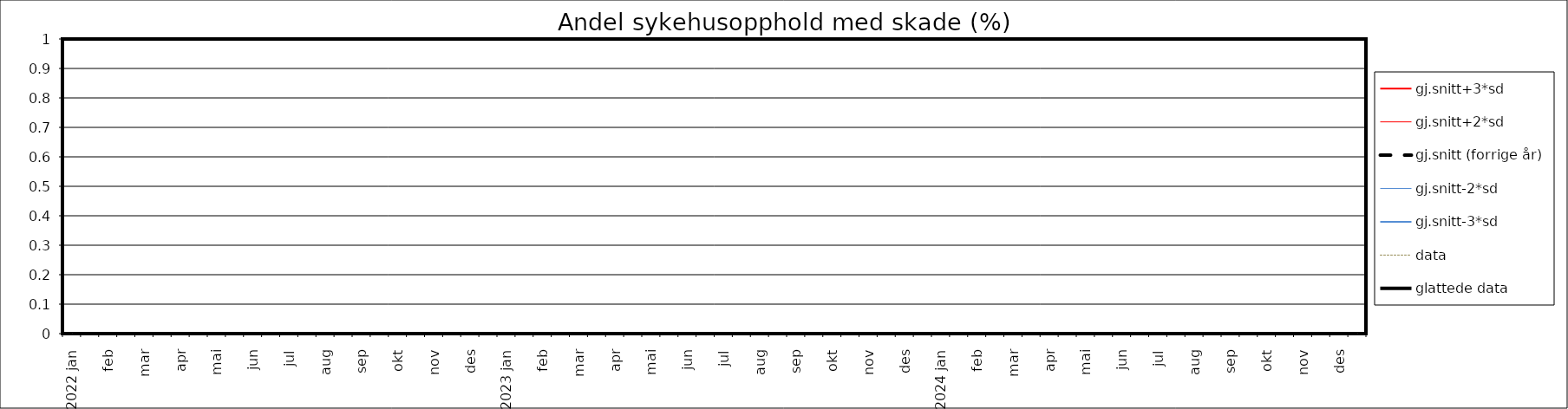
| Category | gj.snitt+3*sd | gj.snitt+2*sd | gj.snitt (forrige år) | gj.snitt-2*sd | gj.snitt-3*sd | data | glattede data |
|---|---|---|---|---|---|---|---|
| 2022 jan | 0 | 0 | 0 | 0 | 0 | 0 | 0 |
|  | 0 | 0 | 0 | 0 | 0 | 0 | 0 |
| feb | 0 | 0 | 0 | 0 | 0 | 0 | 0 |
|  | 0 | 0 | 0 | 0 | 0 | 0 | 0 |
| mar | 0 | 0 | 0 | 0 | 0 | 0 | 0 |
|  | 0 | 0 | 0 | 0 | 0 | 0 | 0 |
| apr | 0 | 0 | 0 | 0 | 0 | 0 | 0 |
|  | 0 | 0 | 0 | 0 | 0 | 0 | 0 |
| mai | 0 | 0 | 0 | 0 | 0 | 0 | 0 |
|  | 0 | 0 | 0 | 0 | 0 | 0 | 0 |
| jun | 0 | 0 | 0 | 0 | 0 | 0 | 0 |
|  | 0 | 0 | 0 | 0 | 0 | 0 | 0 |
| jul | 0 | 0 | 0 | 0 | 0 | 0 | 0 |
|  | 0 | 0 | 0 | 0 | 0 | 0 | 0 |
| aug | 0 | 0 | 0 | 0 | 0 | 0 | 0 |
|  | 0 | 0 | 0 | 0 | 0 | 0 | 0 |
| sep | 0 | 0 | 0 | 0 | 0 | 0 | 0 |
|  | 0 | 0 | 0 | 0 | 0 | 0 | 0 |
| okt | 0 | 0 | 0 | 0 | 0 | 0 | 0 |
|  | 0 | 0 | 0 | 0 | 0 | 0 | 0 |
| nov | 0 | 0 | 0 | 0 | 0 | 0 | 0 |
|  | 0 | 0 | 0 | 0 | 0 | 0 | 0 |
| des | 0 | 0 | 0 | 0 | 0 | 0 | 0 |
|  | 0 | 0 | 0 | 0 | 0 | 0 | 0 |
| 2023 jan | 0 | 0 | 0 | 0 | 0 | 0 | 0 |
|  | 0 | 0 | 0 | 0 | 0 | 0 | 0 |
| feb | 0 | 0 | 0 | 0 | 0 | 0 | 0 |
|  | 0 | 0 | 0 | 0 | 0 | 0 | 0 |
| mar | 0 | 0 | 0 | 0 | 0 | 0 | 0 |
|  | 0 | 0 | 0 | 0 | 0 | 0 | 0 |
| apr | 0 | 0 | 0 | 0 | 0 | 0 | 0 |
|  | 0 | 0 | 0 | 0 | 0 | 0 | 0 |
| mai | 0 | 0 | 0 | 0 | 0 | 0 | 0 |
|  | 0 | 0 | 0 | 0 | 0 | 0 | 0 |
| jun | 0 | 0 | 0 | 0 | 0 | 0 | 0 |
|  | 0 | 0 | 0 | 0 | 0 | 0 | 0 |
| jul | 0 | 0 | 0 | 0 | 0 | 0 | 0 |
|  | 0 | 0 | 0 | 0 | 0 | 0 | 0 |
| aug | 0 | 0 | 0 | 0 | 0 | 0 | 0 |
|  | 0 | 0 | 0 | 0 | 0 | 0 | 0 |
| sep | 0 | 0 | 0 | 0 | 0 | 0 | 0 |
|  | 0 | 0 | 0 | 0 | 0 | 0 | 0 |
| okt | 0 | 0 | 0 | 0 | 0 | 0 | 0 |
|  | 0 | 0 | 0 | 0 | 0 | 0 | 0 |
| nov | 0 | 0 | 0 | 0 | 0 | 0 | 0 |
|  | 0 | 0 | 0 | 0 | 0 | 0 | 0 |
| des | 0 | 0 | 0 | 0 | 0 | 0 | 0 |
|  | 0 | 0 | 0 | 0 | 0 | 0 | 0 |
| 2024 jan | 0 | 0 | 0 | 0 | 0 | 0 | 0 |
|  | 0 | 0 | 0 | 0 | 0 | 0 | 0 |
| feb | 0 | 0 | 0 | 0 | 0 | 0 | 0 |
|  | 0 | 0 | 0 | 0 | 0 | 0 | 0 |
| mar | 0 | 0 | 0 | 0 | 0 | 0 | 0 |
|  | 0 | 0 | 0 | 0 | 0 | 0 | 0 |
| apr | 0 | 0 | 0 | 0 | 0 | 0 | 0 |
|  | 0 | 0 | 0 | 0 | 0 | 0 | 0 |
| mai | 0 | 0 | 0 | 0 | 0 | 0 | 0 |
|  | 0 | 0 | 0 | 0 | 0 | 0 | 0 |
| jun | 0 | 0 | 0 | 0 | 0 | 0 | 0 |
|  | 0 | 0 | 0 | 0 | 0 | 0 | 0 |
| jul | 0 | 0 | 0 | 0 | 0 | 0 | 0 |
|  | 0 | 0 | 0 | 0 | 0 | 0 | 0 |
| aug | 0 | 0 | 0 | 0 | 0 | 0 | 0 |
|  | 0 | 0 | 0 | 0 | 0 | 0 | 0 |
| sep | 0 | 0 | 0 | 0 | 0 | 0 | 0 |
|  | 0 | 0 | 0 | 0 | 0 | 0 | 0 |
| okt | 0 | 0 | 0 | 0 | 0 | 0 | 0 |
|  | 0 | 0 | 0 | 0 | 0 | 0 | 0 |
| nov | 0 | 0 | 0 | 0 | 0 | 0 | 0 |
|  | 0 | 0 | 0 | 0 | 0 | 0 | 0 |
| des | 0 | 0 | 0 | 0 | 0 | 0 | 0 |